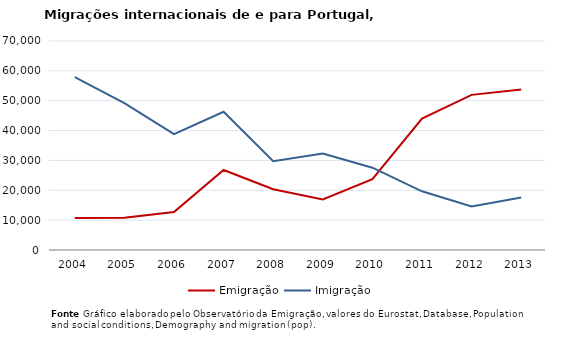
| Category | Emigração | Imigração |
|---|---|---|
| 2004.0 | 10680 | 57920 |
| 2005.0 | 10800 | 49200 |
| 2006.0 | 12700 | 38800 |
| 2007.0 | 26800 | 46300 |
| 2008.0 | 20357 | 29718 |
| 2009.0 | 16899 | 32307 |
| 2010.0 | 23760 | 27575 |
| 2011.0 | 43998 | 19667 |
| 2012.0 | 51958 | 14606 |
| 2013.0 | 53786 | 17554 |